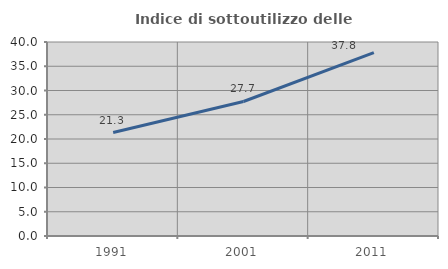
| Category | Indice di sottoutilizzo delle abitazioni  |
|---|---|
| 1991.0 | 21.325 |
| 2001.0 | 27.735 |
| 2011.0 | 37.821 |